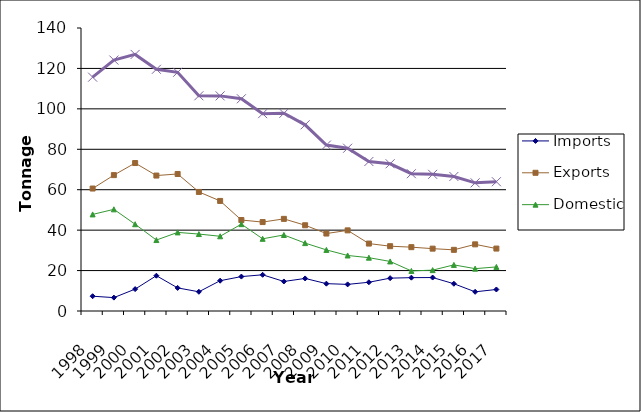
| Category | Imports | Exports | Domestic | TOTAL |
|---|---|---|---|---|
| 1998.0 | 7314 | 60584 | 47782 | 115680 |
| 1999.0 | 6623 | 67222 | 50293 | 124138 |
| 2000.0 | 10822 | 73194 | 42916 | 126932 |
| 2001.0 | 17467 | 67003 | 35098 | 119568 |
| 2002.0 | 11427 | 67783 | 38882 | 118090 |
| 2003.0 | 9501 | 58903 | 38068 | 106472 |
| 2004.0 | 14995 | 54454 | 36970 | 106417 |
| 2005.0 | 17024 | 45002 | 42967 | 104992 |
| 2006.0 | 17909 | 43994 | 35718 | 97621 |
| 2007.0 | 14612 | 45581 | 37619 | 97812 |
| 2008.0 | 16106 | 42416 | 33586 | 92108 |
| 2009.0 | 13532 | 38321 | 30228 | 82081 |
| 2010.0 | 13169 | 39891 | 27468 | 80525 |
| 2011.0 | 14216 | 33358 | 26379 | 73952 |
| 2012.0 | 16254 | 32060 | 24519 | 72832 |
| 2013.0 | 16501 | 31583 | 19833 | 67917 |
| 2014.0 | 16554 | 30842 | 20219 | 67615 |
| 2015.0 | 13481 | 30259 | 22813 | 66552 |
| 2016.0 | 9486 | 32974 | 20950 | 63409 |
| 2017.0 | 10649 | 30886 | 21811 | 63952 |